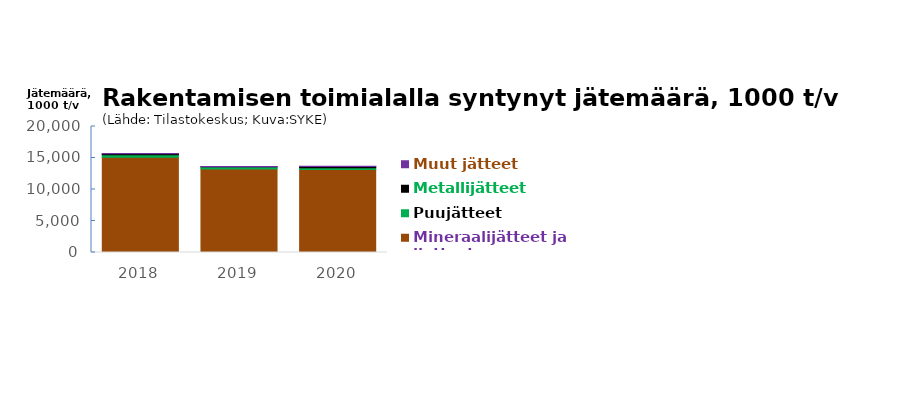
| Category | Mineraalijätteet ja lietteet | Puujätteet | Metallijätteet | Muut jätteet |
|---|---|---|---|---|
| 2018 | 15103 | 401 | 170 | 40 |
| 2019 | 13239 | 381 | 1 | 47 |
| 2020 | 13174 | 273 | 217 | 26 |